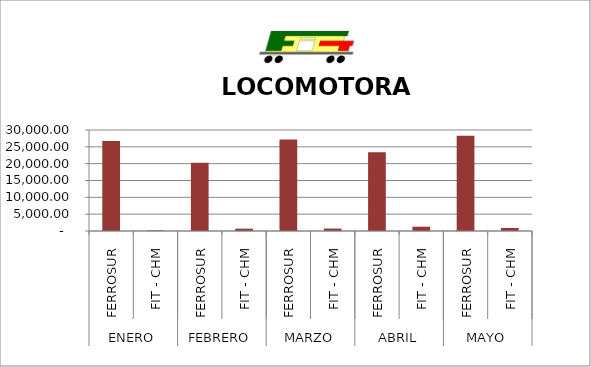
| Category | LOCOMOTORA KM |
|---|---|
| 0 | 26744 |
| 1 | 159 |
| 2 | 20284 |
| 3 | 697 |
| 4 | 27191.5 |
| 5 | 722 |
| 6 | 23387.5 |
| 7 | 1276 |
| 8 | 28285 |
| 9 | 885 |